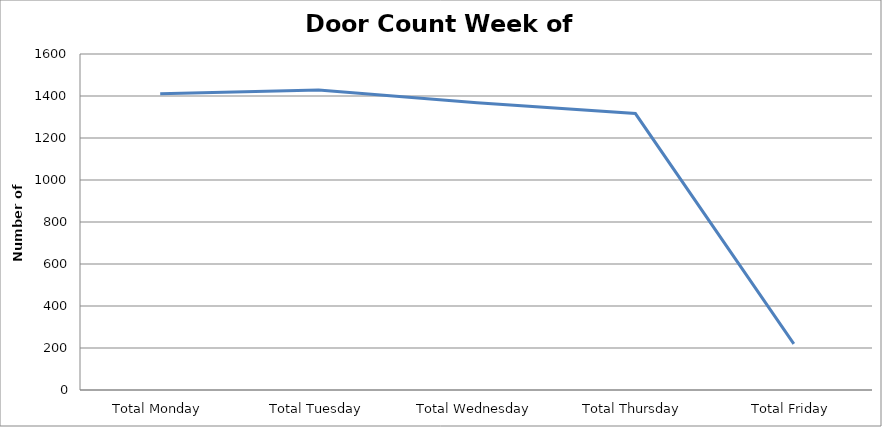
| Category | Series 0 |
|---|---|
| Total Monday | 1410.5 |
| Total Tuesday | 1428.5 |
| Total Wednesday | 1367.5 |
| Total Thursday | 1316.5 |
| Total Friday | 220 |